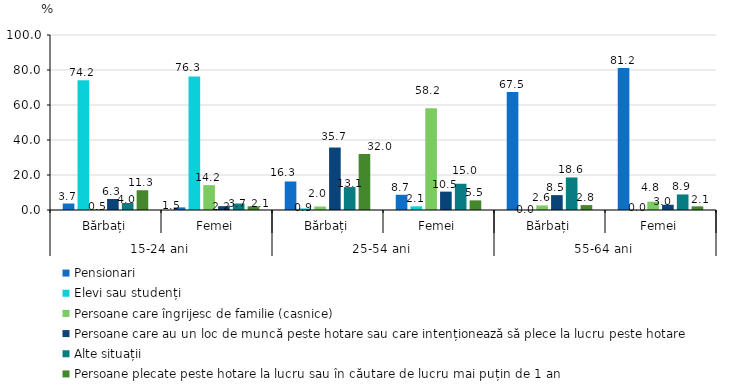
| Category | Pensionari | Elevi sau studenți | Persoane care îngrijesc de familie (casnice) | Persoane care au un loc de muncă peste hotare sau care intenționează să plece la lucru peste hotare | Alte situații | Persoane plecate peste hotare la lucru sau în căutare de lucru mai puțin de 1 an |
|---|---|---|---|---|---|---|
| 0 | 3.7 | 74.2 | 0.5 | 6.3 | 4 | 11.3 |
| 1 | 1.5 | 76.3 | 14.2 | 2.2 | 3.7 | 2.1 |
| 2 | 16.3 | 0.9 | 2 | 35.7 | 13.1 | 32 |
| 3 | 8.7 | 2.1 | 58.2 | 10.5 | 15 | 5.5 |
| 4 | 67.5 | 0 | 2.6 | 8.5 | 18.6 | 2.8 |
| 5 | 81.2 | 0 | 4.8 | 3 | 8.9 | 2.1 |